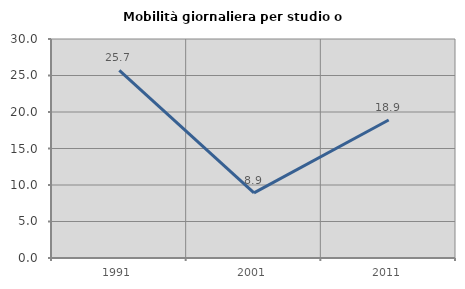
| Category | Mobilità giornaliera per studio o lavoro |
|---|---|
| 1991.0 | 25.714 |
| 2001.0 | 8.929 |
| 2011.0 | 18.9 |